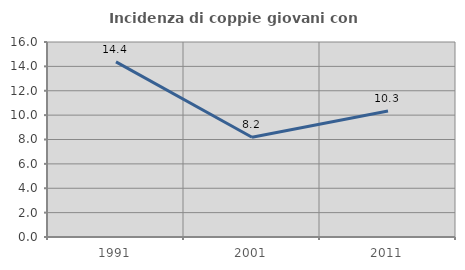
| Category | Incidenza di coppie giovani con figli |
|---|---|
| 1991.0 | 14.373 |
| 2001.0 | 8.188 |
| 2011.0 | 10.336 |